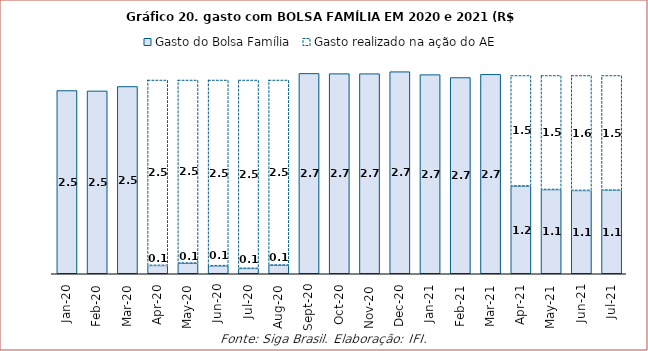
| Category | Gasto do Bolsa Família | Gasto realizado na ação do AE |
|---|---|---|
| 2020-01-01 | 2.476 | 0 |
| 2020-02-01 | 2.471 | 0 |
| 2020-03-01 | 2.531 | 0 |
| 2020-04-01 | 0.113 | 2.505 |
| 2020-05-01 | 0.144 | 2.474 |
| 2020-06-01 | 0.109 | 2.508 |
| 2020-07-01 | 0.073 | 2.545 |
| 2020-08-01 | 0.117 | 2.5 |
| 2020-09-01 | 2.707 | 0 |
| 2020-10-01 | 2.704 | 0 |
| 2020-11-01 | 2.704 | 0 |
| 2020-12-01 | 2.731 | 0 |
| 2021-01-01 | 2.691 | 0 |
| 2021-02-01 | 2.652 | 0 |
| 2021-03-01 | 2.695 | 0 |
| 2021-04-01 | 1.186 | 1.493 |
| 2021-05-01 | 1.139 | 1.54 |
| 2021-06-01 | 1.126 | 1.553 |
| 2021-07-01 | 1.13 | 1.55 |